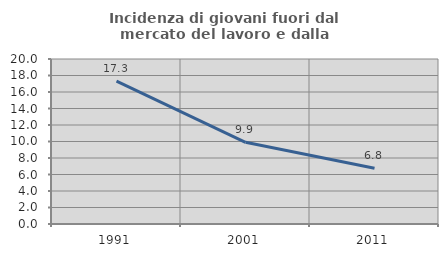
| Category | Incidenza di giovani fuori dal mercato del lavoro e dalla formazione  |
|---|---|
| 1991.0 | 17.323 |
| 2001.0 | 9.901 |
| 2011.0 | 6.757 |